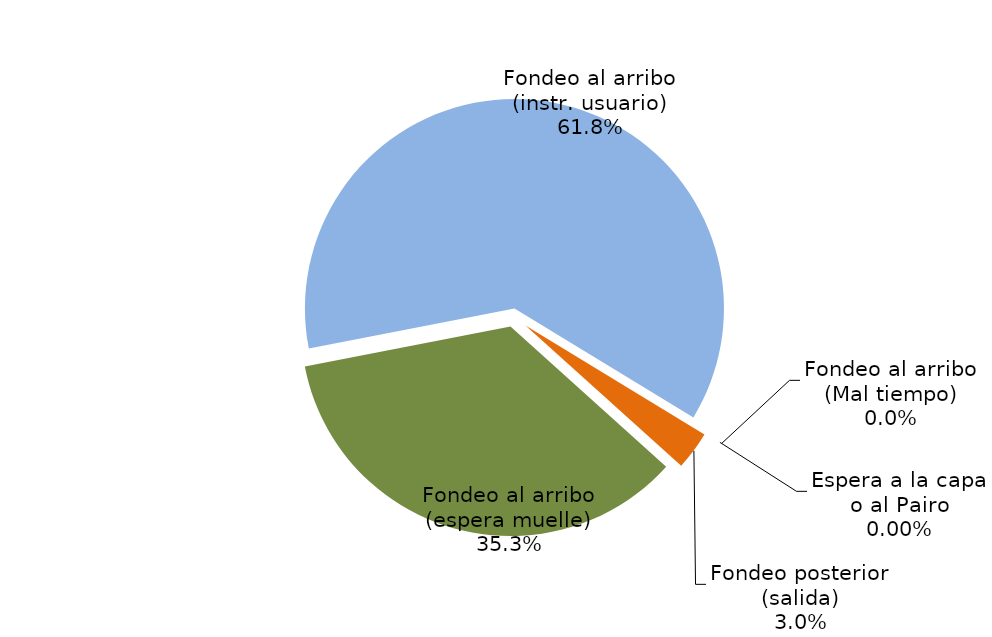
| Category | Series 0 |
|---|---|
| Fondeo al arribo (espera muelle) | 7259.992 |
| Fondeo al arribo (instr. usuario) | 12705.145 |
| Fondeo al arribo (Mal tiempo) | 0 |
| Espera a la capa o al Pairo | 0 |
| Fondeo posterior (salida) | 609.977 |